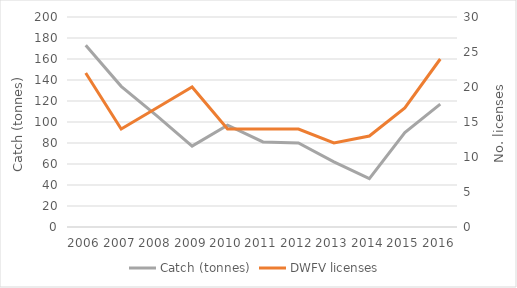
| Category | Catch (tonnes) |
|---|---|
| 2006.0 | 173 |
| 2007.0 | 134 |
| 2008.0 | 106 |
| 2009.0 | 77 |
| 2010.0 | 97 |
| 2011.0 | 81 |
| 2012.0 | 80 |
| 2013.0 | 62 |
| 2014.0 | 46 |
| 2015.0 | 90 |
| 2016.0 | 117 |